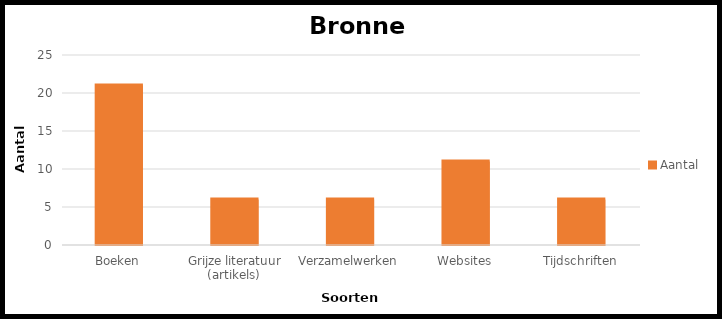
| Category | Aantal |
|---|---|
| Boeken | 21 |
| Grijze literatuur (artikels)  | 6 |
| Verzamelwerken | 6 |
| Websites | 11 |
| Tijdschriften | 6 |